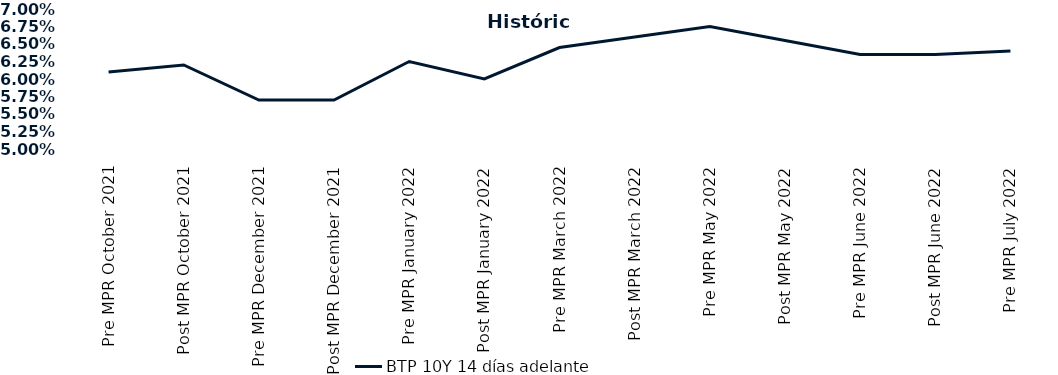
| Category | BTP 10Y 14 días adelante |
|---|---|
| Pre MPR October 2021 | 0.061 |
| Post MPR October 2021 | 0.062 |
| Pre MPR December 2021 | 0.057 |
| Post MPR December 2021 | 0.057 |
| Pre MPR January 2022 | 0.062 |
| Post MPR January 2022 | 0.06 |
| Pre MPR March 2022 | 0.064 |
| Post MPR March 2022 | 0.066 |
| Pre MPR May 2022 | 0.068 |
| Post MPR May 2022 | 0.066 |
| Pre MPR June 2022 | 0.064 |
| Post MPR June 2022 | 0.064 |
| Pre MPR July 2022 | 0.064 |